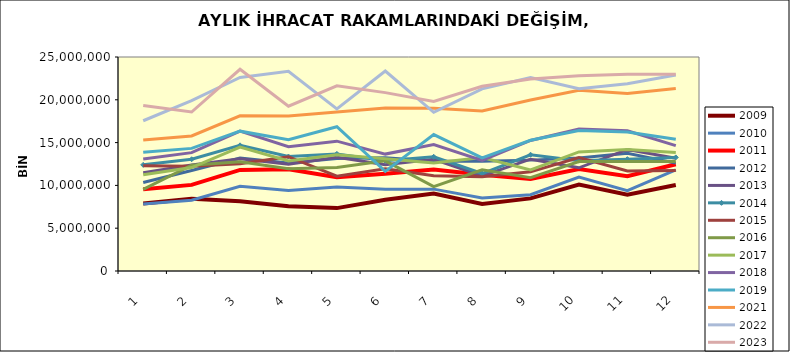
| Category | 2009 | 2010 | 2011 | 2012 | 2013 | 2014 | 2015 | 2016 | 2017 | 2018 | 2019 | 2021 | 2022 | 2023 |
|---|---|---|---|---|---|---|---|---|---|---|---|---|---|---|
| 0 | 7884493.524 | 7828748.058 | 9551084.639 | 10348187.166 | 11481521.079 | 12399761.948 | 12301766.75 | 9546115.4 | 11247585.677 | 13080096.762 | 13874826.012 | 15306487.644 | 17553745.067 | 19324344.316 |
| 1 | 8435115.834 | 8263237.814 | 10059126.307 | 11748000.124 | 12385690.909 | 13053292.493 | 12231860.14 | 12366388.057 | 12089908.934 | 13827132.655 | 14323043.042 | 15777151.374 | 19904331.12 | 18570293.258 |
| 2 | 8155485.081 | 9886488.171 | 11811085.16 | 13208572.977 | 13122058.141 | 14680110.78 | 12519910.438 | 12757672.093 | 14470814.059 | 16338253.918 | 16335862.397 | 18125533.346 | 22609642.478 | 23561564.76 |
| 3 | 7561696.283 | 9396006.654 | 11873269.447 | 12630226.718 | 12468202.903 | 13371185.664 | 13349346.866 | 11950497.685 | 12859938.791 | 14530822.873 | 15340619.825 | 18106582.521 | 23330991.125 | 19256618.86 |
| 4 | 7346407.528 | 9799958.117 | 10943364.372 | 13131530.961 | 13277209.017 | 13681906.159 | 11080385.127 | 12098611.067 | 13582079.731 | 15166648.044 | 16855105.097 | 18587253.597 | 18931811.633 | 21633834.051 |
| 5 | 8329692.783 | 9542907.644 | 11349953.558 | 13231198.688 | 12399973.962 | 12880924.246 | 11949647.086 | 12864154.06 | 13125306.944 | 13657091.159 | 11634653.881 | 19036800.67 | 23359482.376 | 20836974.291 |
| 6 | 9055733.671 | 9564682.545 | 11860004.271 | 12830675.307 | 13059519.685 | 13344776.958 | 11129358.974 | 9850124.872 | 12612074.056 | 14771360.698 | 15932004.724 | 19020902.292 | 18536547.531 | 19795531.607 |
| 7 | 7839908.842 | 8523451.973 | 11245124.657 | 12831394.572 | 11118300.903 | 11386828.925 | 11022045.344 | 11830762.82 | 13248462.99 | 12926754.199 | 13222876.223 | 18681996.898 | 21275849.662 | 21578961.686 |
| 8 | 8480708.387 | 8909230.521 | 10750626.099 | 12952651.722 | 13060371.039 | 13583120.906 | 11581703.842 | 10901638.452 | 11810080.805 | 15247368.846 | 15273579.961 | 19984264.498 | 22596774.302 | 22441682.444 |
| 9 | 10095768.03 | 10963586.27 | 11907219.297 | 13190769.655 | 12053704.638 | 12891630.102 | 13240039.088 | 12796159.91 | 13912699.494 | 16590652.49 | 16410781.68 | 21100833.128 | 21300785.132 | 22811866.119 |
| 10 | 8903010.773 | 9382369.718 | 11078524.743 | 13753052.493 | 14201227.351 | 13067348.107 | 11681989.013 | 12786936.247 | 14188323.116 | 16386878.393 | 16242650.391 | 20749365.995 | 21871038.612 | 22998694.166 |
| 11 | 10054591.867 | 11822551.699 | 12477486.28 | 12605476.173 | 13174857.46 | 13269271.402 | 11750818.76 | 12780523.145 | 13845665.817 | 14645696.251 | 15386718.469 | 21316881.481 | 22898748.625 | 22998556.443 |